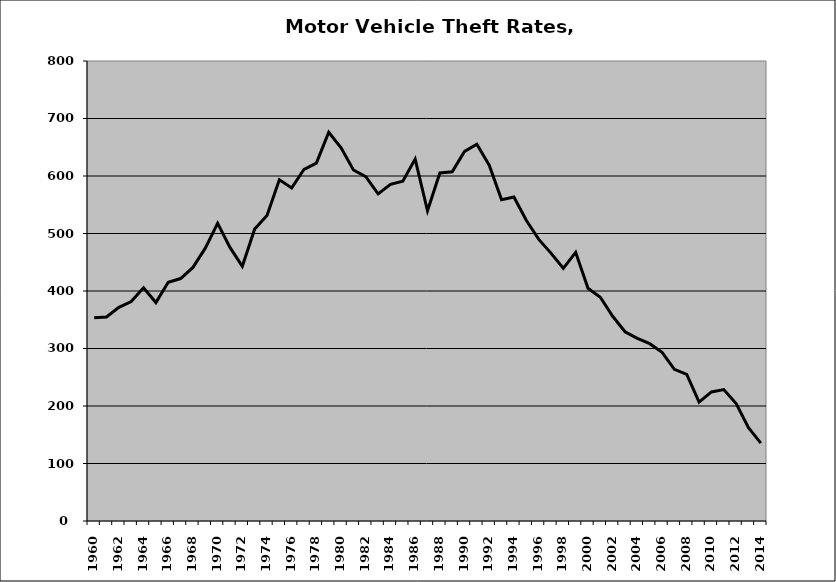
| Category | Motor Vehicle |
|---|---|
| 1960.0 | 353.323 |
| 1961.0 | 354.767 |
| 1962.0 | 371.674 |
| 1963.0 | 381.595 |
| 1964.0 | 405.711 |
| 1965.0 | 379.914 |
| 1966.0 | 415.314 |
| 1967.0 | 421.656 |
| 1968.0 | 441.042 |
| 1969.0 | 474.482 |
| 1970.0 | 517.825 |
| 1971.0 | 475.768 |
| 1972.0 | 443.01 |
| 1973.0 | 507.707 |
| 1974.0 | 531.444 |
| 1975.0 | 593.513 |
| 1976.0 | 579.304 |
| 1977.0 | 611.676 |
| 1978.0 | 622.512 |
| 1979.0 | 675.975 |
| 1980.0 | 648.953 |
| 1981.0 | 610.467 |
| 1982.0 | 599.013 |
| 1983.0 | 568.962 |
| 1984.0 | 585.588 |
| 1985.0 | 590.897 |
| 1986.0 | 629.385 |
| 1987.0 | 539.518 |
| 1988.0 | 605.301 |
| 1989.0 | 607.36 |
| 1990.0 | 642.775 |
| 1991.0 | 655.306 |
| 1992.0 | 618.829 |
| 1993.0 | 558.699 |
| 1994.0 | 563.462 |
| 1995.0 | 523.026 |
| 1996.0 | 490.225 |
| 1997.0 | 465.896 |
| 1998.0 | 439.452 |
| 1999.0 | 467.235 |
| 2000.0 | 404.749 |
| 2001.0 | 389.234 |
| 2002.0 | 356.034 |
| 2003.0 | 329.138 |
| 2004.0 | 317.597 |
| 2005.0 | 308.435 |
| 2006.0 | 293.338 |
| 2007.0 | 263.66 |
| 2008.0 | 254.817 |
| 2009.0 | 206.624 |
| 2010.0 | 224.432 |
| 2011.0 | 228.519 |
| 2012.0 | 204.318 |
| 2013.0 | 162.103 |
| 2014.0 | 135.483 |